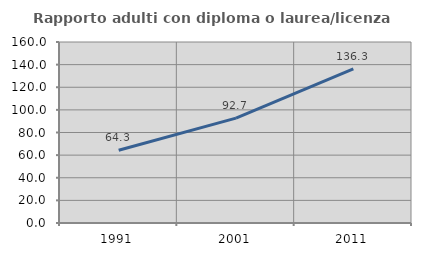
| Category | Rapporto adulti con diploma o laurea/licenza media  |
|---|---|
| 1991.0 | 64.295 |
| 2001.0 | 92.683 |
| 2011.0 | 136.344 |